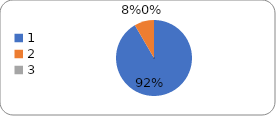
| Category | Series 0 |
|---|---|
| 0 | 98 |
| 1 | 9 |
| 2 | 0 |